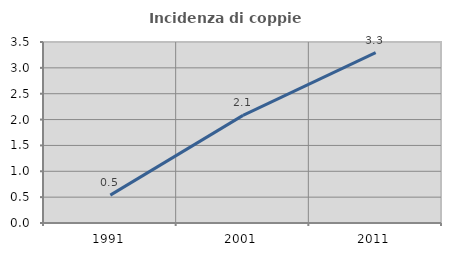
| Category | Incidenza di coppie miste |
|---|---|
| 1991.0 | 0.539 |
| 2001.0 | 2.081 |
| 2011.0 | 3.296 |